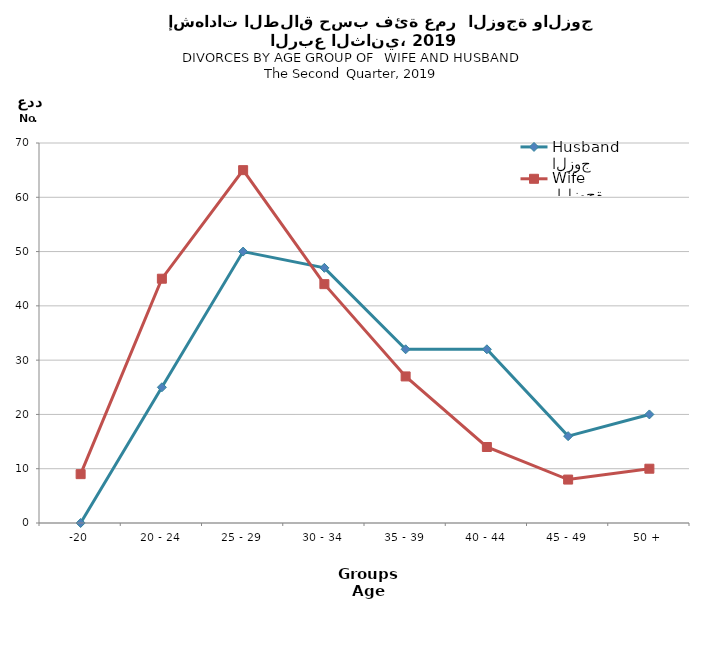
| Category | الزوج
Husband |  الزوجة
Wife |
|---|---|---|
| -20 | 0 | 9 |
| 20 - 24 | 25 | 45 |
| 25 - 29 | 50 | 65 |
| 30 - 34 | 47 | 44 |
| 35 - 39 | 32 | 27 |
| 40 - 44 | 32 | 14 |
| 45 - 49 | 16 | 8 |
| 50 + | 20 | 10 |